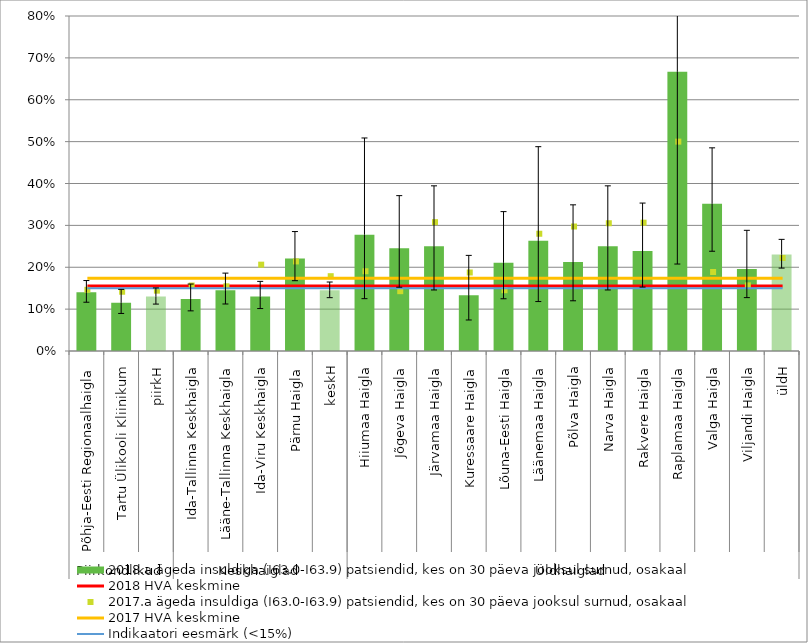
| Category | 2018.a ägeda insuldiga (I63.0-I63.9) patsiendid, kes on 30 päeva jooksul surnud, osakaal |
|---|---|
| 0 | 0.14 |
| 1 | 0.115 |
| 2 | 0.13 |
| 3 | 0.124 |
| 4 | 0.145 |
| 5 | 0.13 |
| 6 | 0.221 |
| 7 | 0.145 |
| 8 | 0.278 |
| 9 | 0.246 |
| 10 | 0.25 |
| 11 | 0.133 |
| 12 | 0.211 |
| 13 | 0.263 |
| 14 | 0.213 |
| 15 | 0.25 |
| 16 | 0.239 |
| 17 | 0.667 |
| 18 | 0.352 |
| 19 | 0.196 |
| 20 | 0.231 |